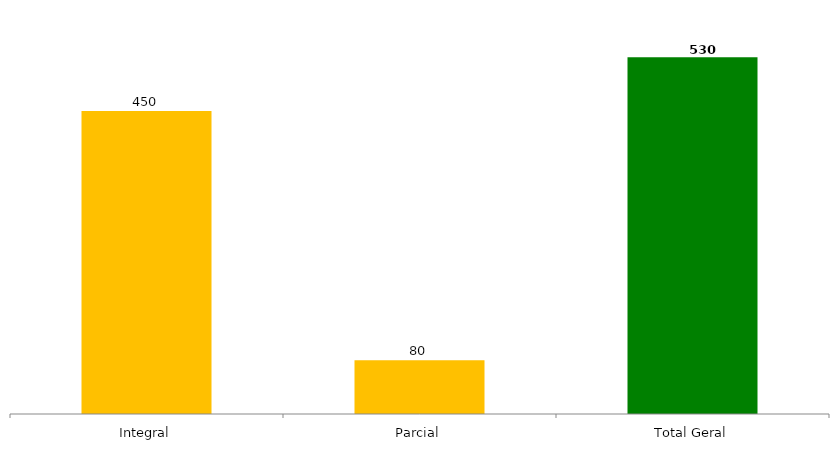
| Category | Categoria/Ano |
|---|---|
| Integral | 450 |
| Parcial | 80 |
| Total Geral | 530 |